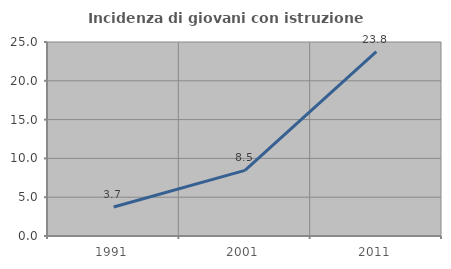
| Category | Incidenza di giovani con istruzione universitaria |
|---|---|
| 1991.0 | 3.729 |
| 2001.0 | 8.456 |
| 2011.0 | 23.753 |